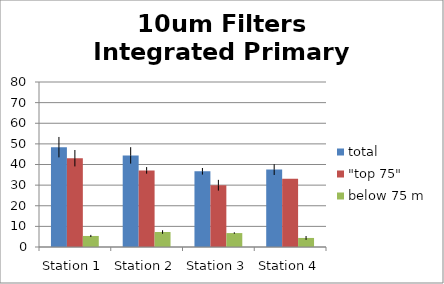
| Category | total | "top 75" | below 75 m |
|---|---|---|---|
| Station 1 | 48.402 | 43.049 | 5.353 |
| Station 2 | 44.409 | 37.146 | 7.264 |
| Station 3 | 36.694 | 29.943 | 6.75 |
| Station 4 | 37.524 | 33.136 | 4.388 |